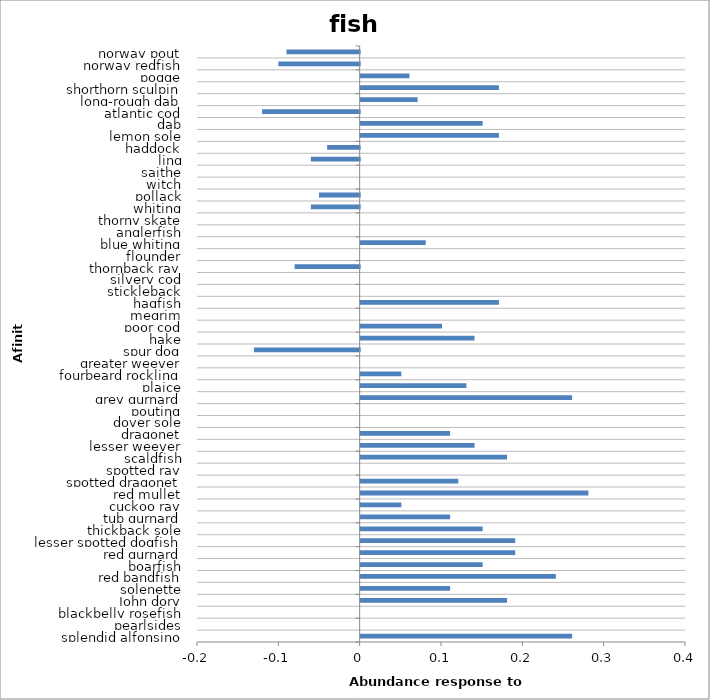
| Category | fish |
|---|---|
| splendid alfonsino | 0.26 |
| pearlsides | 0 |
| blackbelly rosefish | 0 |
| John dory | 0.18 |
| solenette | 0.11 |
| red bandfish | 0.24 |
| boarfish | 0.15 |
| red gurnard | 0.19 |
| lesser spotted dogfish | 0.19 |
| thickback sole | 0.15 |
| tub gurnard | 0.11 |
| cuckoo ray | 0.05 |
| red mullet | 0.28 |
| spotted dragonet | 0.12 |
| spotted ray | 0 |
| scaldfish | 0.18 |
| lesser weever | 0.14 |
| dragonet | 0.11 |
| dover sole | 0 |
| pouting | 0 |
| grey gurnard | 0.26 |
| plaice | 0.13 |
| fourbeard rockling | 0.05 |
| greater weever | 0 |
| spur dog | -0.13 |
| hake | 0.14 |
| poor cod | 0.1 |
| megrim | 0 |
| hagfish | 0.17 |
| stickleback | 0 |
| silvery cod | 0 |
| thornback ray | -0.08 |
| flounder | 0 |
| blue whiting | 0.08 |
| anglerfish | 0 |
| thorny skate | 0 |
| whiting | -0.06 |
| pollack | -0.05 |
| witch | 0 |
| saithe | 0 |
| ling | -0.06 |
| haddock | -0.04 |
| lemon sole | 0.17 |
| dab | 0.15 |
| atlantic cod | -0.12 |
| long-rough dab | 0.07 |
| shorthorn sculpin | 0.17 |
| pogge | 0.06 |
| norway redfish | -0.1 |
| norway pout | -0.09 |